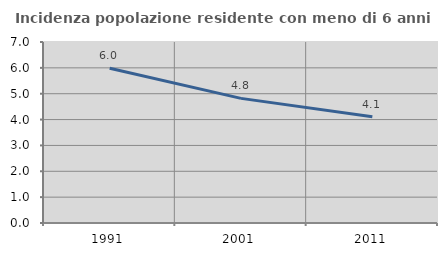
| Category | Incidenza popolazione residente con meno di 6 anni |
|---|---|
| 1991.0 | 5.987 |
| 2001.0 | 4.819 |
| 2011.0 | 4.113 |